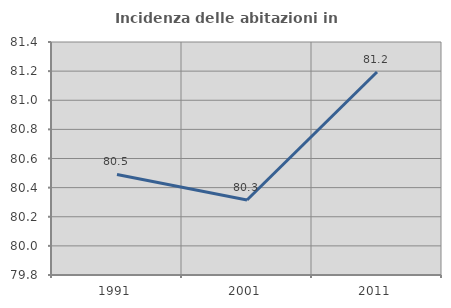
| Category | Incidenza delle abitazioni in proprietà  |
|---|---|
| 1991.0 | 80.491 |
| 2001.0 | 80.315 |
| 2011.0 | 81.194 |